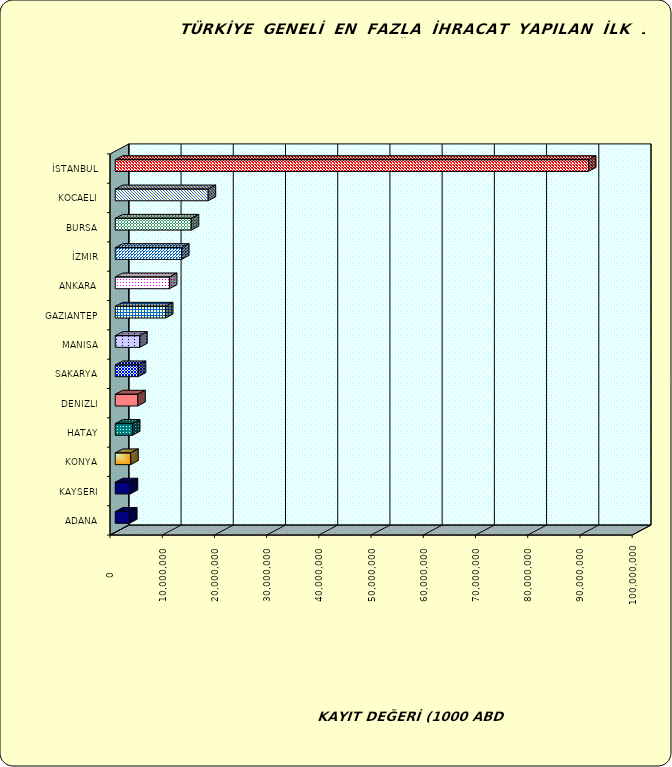
| Category | Series 0 |
|---|---|
| İSTANBUL | 90633355.887 |
| KOCAELI | 17801027.185 |
| BURSA | 14562195.888 |
| İZMIR | 12703717.428 |
| ANKARA | 10381133.137 |
| GAZIANTEP | 9622522.523 |
| MANISA | 4686747.366 |
| SAKARYA | 4416277.808 |
| DENIZLI | 4320326.476 |
| HATAY | 3299166.004 |
| KONYA | 2970146.146 |
| KAYSERI | 2871854.105 |
| ADANA | 2744973.09 |